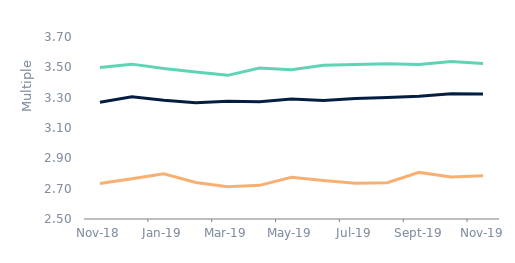
| Category | First-time
buyers | Homemovers | Remortgagors |
|---|---|---|---|
| 2018-11-01 | 3.5 | 3.27 | 2.733 |
| 2018-12-01 | 3.521 | 3.305 | 2.766 |
| 2019-01-01 | 3.493 | 3.283 | 2.798 |
| 2019-02-01 | 3.47 | 3.267 | 2.74 |
| 2019-03-01 | 3.447 | 3.276 | 2.713 |
| 2019-04-01 | 3.495 | 3.274 | 2.722 |
| 2019-05-01 | 3.483 | 3.291 | 2.775 |
| 2019-06-01 | 3.514 | 3.282 | 2.754 |
| 2019-07-01 | 3.519 | 3.295 | 2.736 |
| 2019-08-01 | 3.523 | 3.301 | 2.739 |
| 2019-09-01 | 3.519 | 3.309 | 2.807 |
| 2019-10-01 | 3.539 | 3.325 | 2.778 |
| 2019-11-01 | 3.526 | 3.324 | 2.786 |